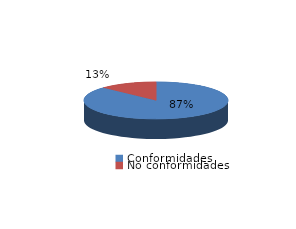
| Category | Series 0 |
|---|---|
| Conformidades | 167 |
| No conformidades | 25 |